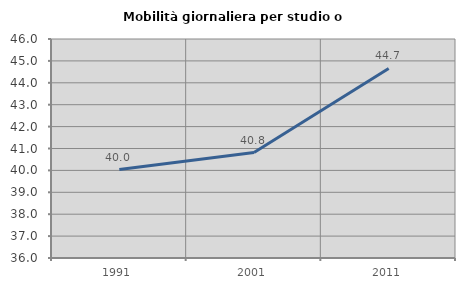
| Category | Mobilità giornaliera per studio o lavoro |
|---|---|
| 1991.0 | 40.04 |
| 2001.0 | 40.816 |
| 2011.0 | 44.654 |